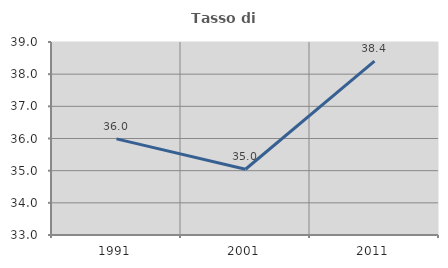
| Category | Tasso di occupazione   |
|---|---|
| 1991.0 | 35.988 |
| 2001.0 | 35.044 |
| 2011.0 | 38.405 |